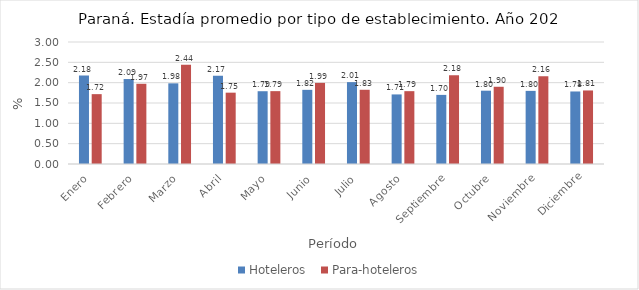
| Category | Hoteleros  | Para-hoteleros |
|---|---|---|
| Enero | 2.175 | 1.718 |
| Febrero | 2.089 | 1.973 |
| Marzo | 1.983 | 2.443 |
| Abril | 2.171 | 1.754 |
| Mayo | 1.79 | 1.792 |
| Junio | 1.824 | 1.995 |
| Julio | 2.013 | 1.825 |
| Agosto | 1.711 | 1.791 |
| Septiembre | 1.699 | 2.179 |
| Octubre | 1.803 | 1.899 |
| Noviembre | 1.798 | 2.155 |
| Diciembre | 1.783 | 1.808 |